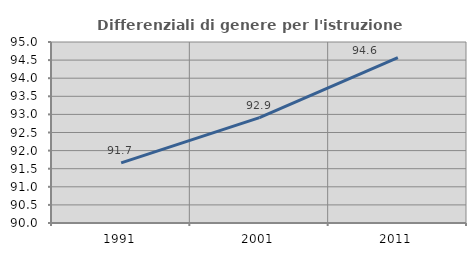
| Category | Differenziali di genere per l'istruzione superiore |
|---|---|
| 1991.0 | 91.662 |
| 2001.0 | 92.912 |
| 2011.0 | 94.571 |